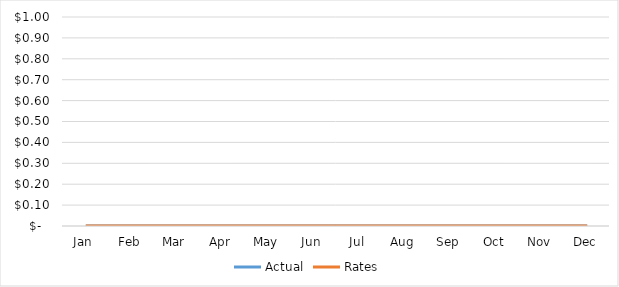
| Category | Actual | Rates |
|---|---|---|
| Jan | 0 | 0 |
| Feb | 0 | 0 |
| Mar | 0 | 0 |
| Apr | 0 | 0 |
| May | 0 | 0 |
| Jun | 0 | 0 |
| Jul | 0 | 0 |
| Aug | 0 | 0 |
| Sep | 0 | 0 |
| Oct | 0 | 0 |
| Nov | 0 | 0 |
| Dec | 0 | 0 |